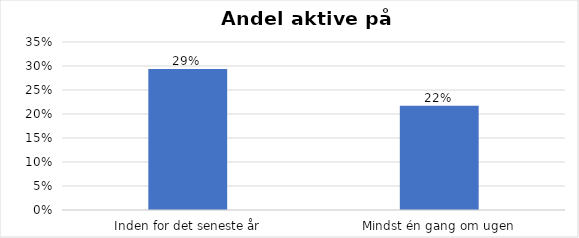
| Category | % |
|---|---|
| Inden for det seneste år | 0.294 |
| Mindst én gang om ugen | 0.217 |